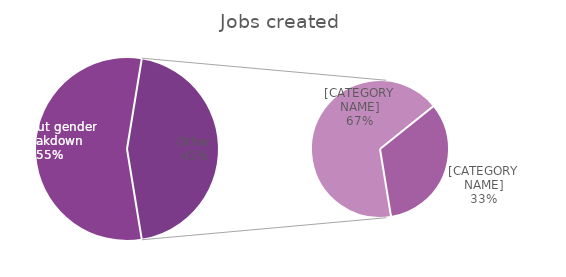
| Category | Jobs created |
|---|---|
| Without gender breakdown | 4596574 |
| Male | 2497091.6 |
| Female | 1239692.4 |